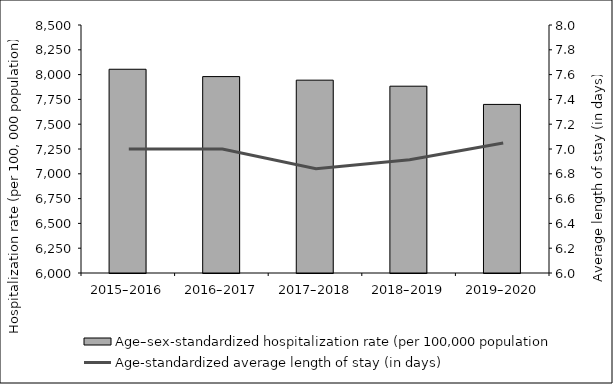
| Category | Age–sex-standardized hospitalization rate (per 100,000 population) |
|---|---|
| 2015–2016 | 8053.914 |
| 2016–2017 | 7980 |
| 2017–2018 | 7943.875 |
| 2018–2019 | 7883.11 |
| 2019–2020 | 7699.481 |